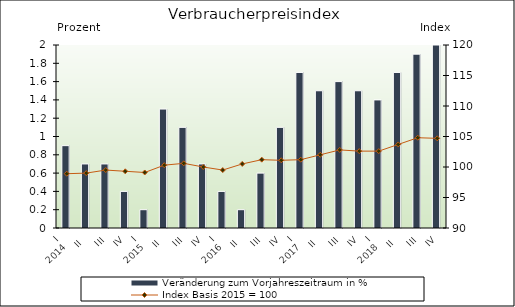
| Category | Veränderung zum Vorjahreszeitraum in % |
|---|---|
| 0 | 0.9 |
| 1 | 0.7 |
| 2 | 0.7 |
| 3 | 0.4 |
| 4 | 0.2 |
| 5 | 1.3 |
| 6 | 1.1 |
| 7 | 0.7 |
| 8 | 0.4 |
| 9 | 0.2 |
| 10 | 0.6 |
| 11 | 1.1 |
| 12 | 1.7 |
| 13 | 1.5 |
| 14 | 1.6 |
| 15 | 1.5 |
| 16 | 1.4 |
| 17 | 1.7 |
| 18 | 1.9 |
| 19 | 2 |